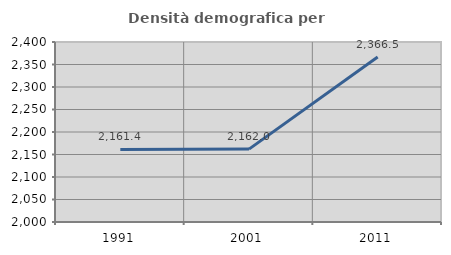
| Category | Densità demografica |
|---|---|
| 1991.0 | 2161.387 |
| 2001.0 | 2161.968 |
| 2011.0 | 2366.462 |